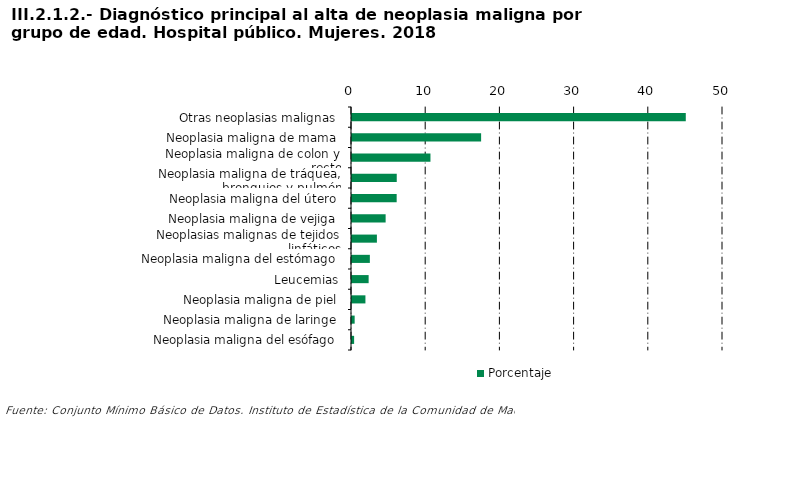
| Category | Porcentaje |
|---|---|
| Otras neoplasias malignas | 44.985 |
| Neoplasia maligna de mama | 17.401 |
| Neoplasia maligna de colon y recto | 10.574 |
| Neoplasia maligna de tráquea, bronquios y pulmón | 6.031 |
| Neoplasia maligna del útero | 6.02 |
| Neoplasia maligna de vejiga | 4.532 |
| Neoplasias malignas de tejidos linfáticos | 3.356 |
| Neoplasia maligna del estómago | 2.406 |
| Leucemias | 2.242 |
| Neoplasia maligna de piel | 1.81 |
| Neoplasia maligna de laringe | 0.359 |
| Neoplasia maligna del esófago | 0.285 |